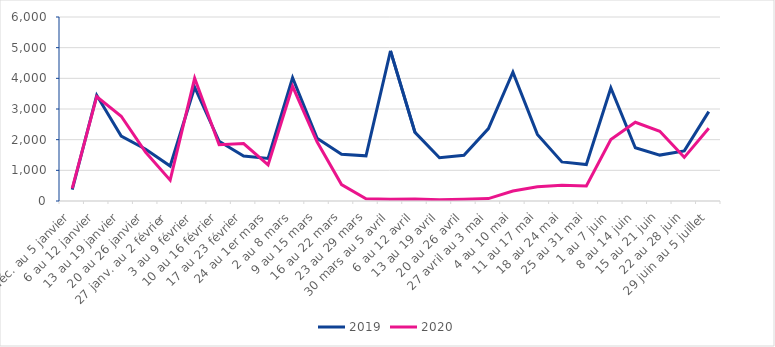
| Category | 2019 | 2020 |
|---|---|---|
| 30 déc. au 5 janvier | 369 | 411 |
| 6 au 12 janvier | 3446 | 3402 |
| 13 au 19 janvier | 2117 | 2765 |
| 20 au 26 janvier | 1689 | 1587 |
| 27 janv. au 2 février | 1140 | 678 |
| 3 au 9 février | 3711 | 4003 |
| 10 au 16 février | 1947 | 1835 |
| 17 au 23 février | 1464 | 1875 |
| 24 au 1er mars | 1389 | 1178 |
| 2 au 8 mars | 4019 | 3741 |
| 9 au 15 mars | 2049 | 1930 |
| 16 au 22 mars | 1525 | 536 |
| 23 au 29 mars | 1473 | 74 |
| 30 mars au 5 avril | 4896 | 61 |
| 6 au 12 avril | 2237 | 69 |
| 13 au 19 avril | 1410 | 40 |
| 20 au 26 avril | 1489 | 60 |
| 27 avril au 3 mai | 2361 | 79 |
| 4 au 10 mai | 4200 | 325 |
| 11 au 17 mai | 2172 | 463 |
| 18 au 24 mai | 1275 | 516 |
| 25 au 31 mai | 1190 | 489 |
| 1 au 7 juin | 3685 | 2003 |
| 8 au 14 juin | 1736 | 2567 |
| 15 au 21 juin | 1497 | 2273 |
| 22 au 28 juin | 1634 | 1423 |
| 29 juin au 5 juillet | 2913 | 2371 |